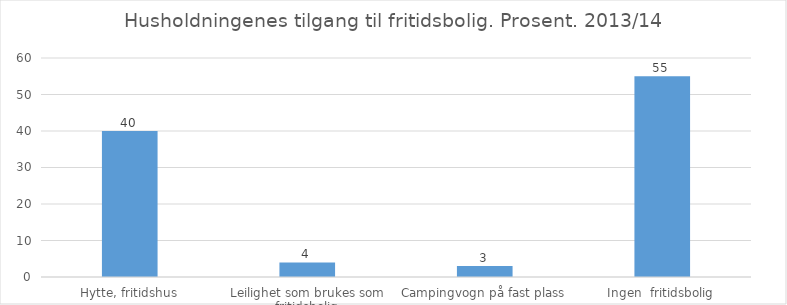
| Category | Andel  (i %) |
|---|---|
| Hytte, fritidshus | 40 |
| Leilighet som brukes som fritidsbolig | 4 |
| Campingvogn på fast plass | 3 |
| Ingen  fritidsbolig | 55 |